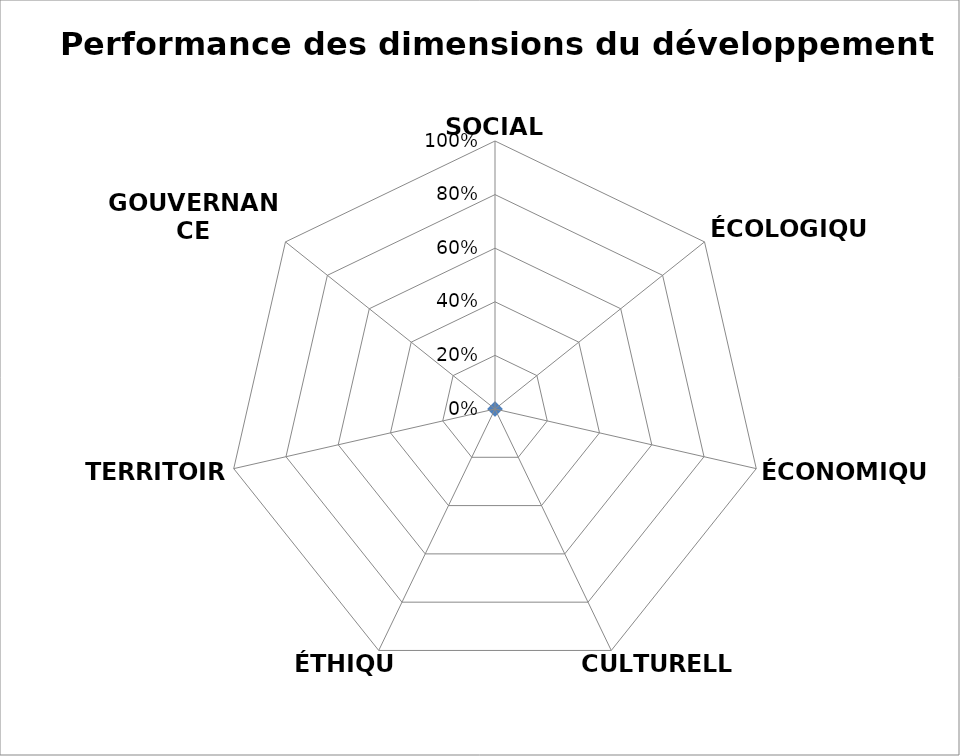
| Category | Series 0 |
|---|---|
| SOCIALE | 0 |
| ÉCOLOGIQUE | 0 |
| ÉCONOMIQUE | 0 |
| CULTURELLE | 0 |
| ÉTHIQUE | 0 |
| TERRITOIRE | 0 |
| GOUVERNANCE | 0 |